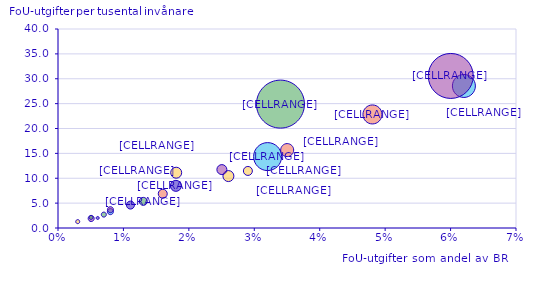
| Category | FoU-utgifter som andel av BRP |
|---|---|
| 0.034 | 24.9 |
| 0.048 | 22.9 |
| 0.003 | 1.3 |
| 0.062 | 28.6 |
| 0.016 | 6.9 |
| 0.026 | 10.5 |
| 0.018 | 8.5 |
| 0.025 | 11.8 |
| 0.007 | 2.7 |
| 0.006 | 2.1 |
| 0.029 | 11.5 |
| 0.032 | 14.4 |
| 0.005 | 2 |
| 0.06 | 30.6 |
| 0.013 | 5.4 |
| 0.008 | 3.3 |
| 0.011 | 4.7 |
| 0.008 | 3.7 |
| 0.005 | 2.2 |
| 0.035 | 15.7 |
| 0.018 | 11.2 |